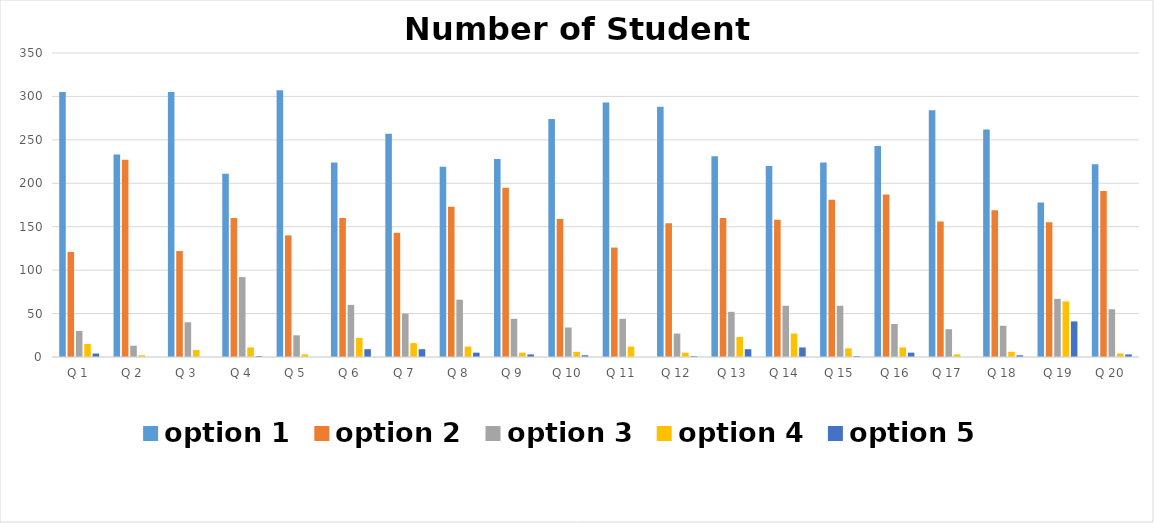
| Category | option 1 | option 2 | option 3 | option 4 | option 5 |
|---|---|---|---|---|---|
| Q 1 | 305 | 121 | 30 | 15 | 4 |
| Q 2 | 233 | 227 | 13 | 2 | 0 |
| Q 3 | 305 | 122 | 40 | 8 | 0 |
| Q 4 | 211 | 160 | 92 | 11 | 1 |
| Q 5 | 307 | 140 | 25 | 3 | 0 |
| Q 6 | 224 | 160 | 60 | 22 | 9 |
| Q 7 | 257 | 143 | 50 | 16 | 9 |
| Q 8 | 219 | 173 | 66 | 12 | 5 |
| Q 9 | 228 | 195 | 44 | 5 | 3 |
| Q 10 | 274 | 159 | 34 | 6 | 2 |
| Q 11 | 293 | 126 | 44 | 12 | 0 |
| Q 12 | 288 | 154 | 27 | 5 | 1 |
|  Q 13 | 231 | 160 | 52 | 23 | 9 |
| Q 14 | 220 | 158 | 59 | 27 | 11 |
| Q 15 | 224 | 181 | 59 | 10 | 1 |
|  Q 16 | 243 | 187 | 38 | 11 | 5 |
| Q 17 | 284 | 156 | 32 | 3 | 0 |
| Q 18 | 262 | 169 | 36 | 6 | 2 |
|  Q 19 | 178 | 155 | 67 | 64 | 41 |
| Q 20 | 222 | 191 | 55 | 4 | 3 |